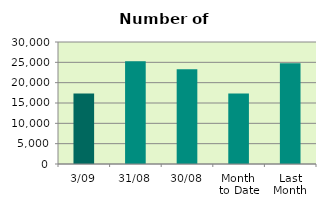
| Category | Series 0 |
|---|---|
| 3/09 | 17322 |
| 31/08 | 25284 |
| 30/08 | 23318 |
| Month 
to Date | 17320 |
| Last
Month | 24784.957 |